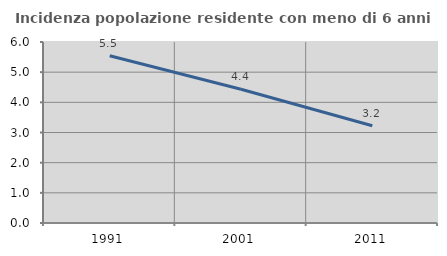
| Category | Incidenza popolazione residente con meno di 6 anni |
|---|---|
| 1991.0 | 5.543 |
| 2001.0 | 4.434 |
| 2011.0 | 3.226 |